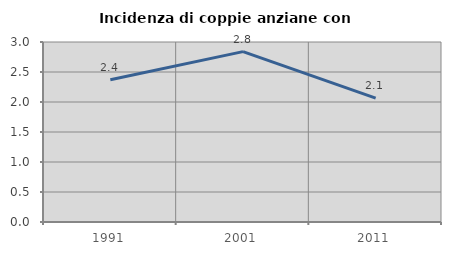
| Category | Incidenza di coppie anziane con figli |
|---|---|
| 1991.0 | 2.371 |
| 2001.0 | 2.84 |
| 2011.0 | 2.064 |